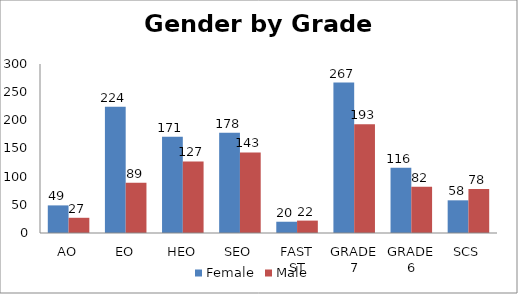
| Category | Female | Male |
|---|---|---|
| AO | 49 | 27 |
| EO | 224 | 89 |
| HEO | 171 | 127 |
| SEO | 178 | 143 |
| FAST ST | 20 | 22 |
| GRADE 7 | 267 | 193 |
| GRADE 6 | 116 | 82 |
| SCS | 58 | 78 |